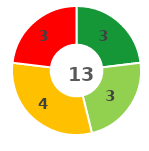
| Category | Series 0 |
|---|---|
| 0 | 3 |
| 1 | 3 |
| 2 | 4 |
| 3 | 3 |
| 4 | 0 |